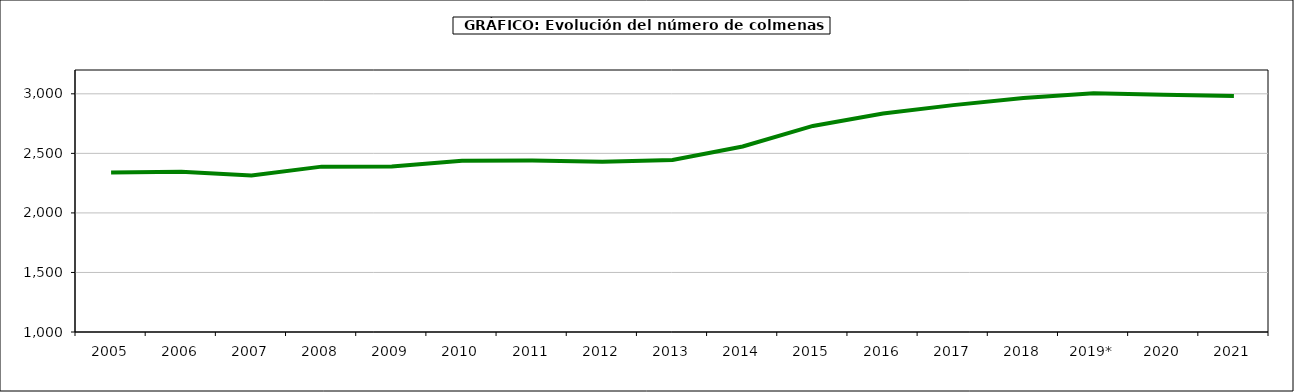
| Category | colmenas |
|---|---|
| 2005 | 2338.342 |
| 2006 | 2345.368 |
| 2007 | 2313.454 |
| 2008 | 2388.595 |
| 2009 | 2389.999 |
| 2010 | 2438 |
| 2011 | 2439.718 |
| 2012 | 2430.196 |
| 2013 | 2444.097 |
| 2014 | 2557.301 |
| 2015 | 2730.296 |
| 2016 | 2834.514 |
| 2017 | 2904.971 |
| 2018 | 2965.557 |
| 2019* | 3004.184 |
| 2020 | 2992.974 |
| 2021 | 2982.587 |